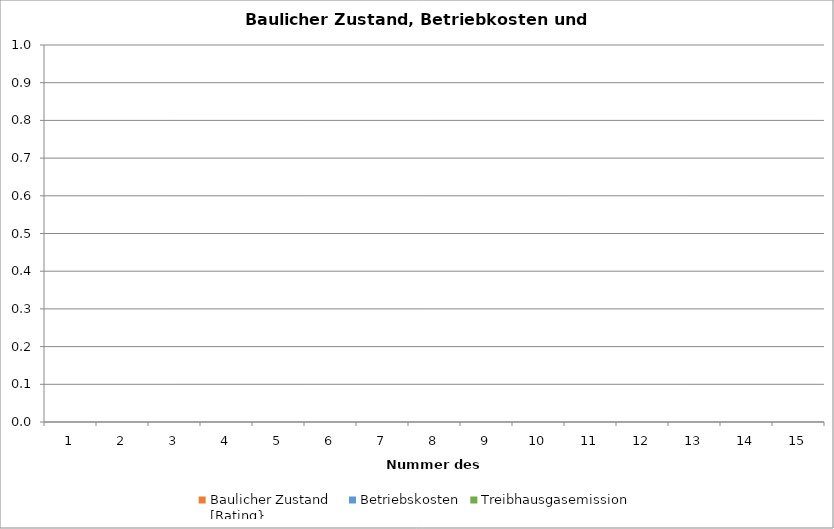
| Category | Baulicher Zustand
[Rating} | Betriebskosten | Treibhausgasemission |
|---|---|---|---|
| 0 | 0 | 0 | 0 |
| 1 | 0 | 0 | 0 |
| 2 | 0 | 0 | 0 |
| 3 | 0 | 0 | 0 |
| 4 | 0 | 0 | 0 |
| 5 | 0 | 0 | 0 |
| 6 | 0 | 0 | 0 |
| 7 | 0 | 0 | 0 |
| 8 | 0 | 0 | 0 |
| 9 | 0 | 0 | 0 |
| 10 | 0 | 0 | 0 |
| 11 | 0 | 0 | 0 |
| 12 | 0 | 0 | 0 |
| 13 | 0 | 0 | 0 |
| 14 | 0 | 0 | 0 |